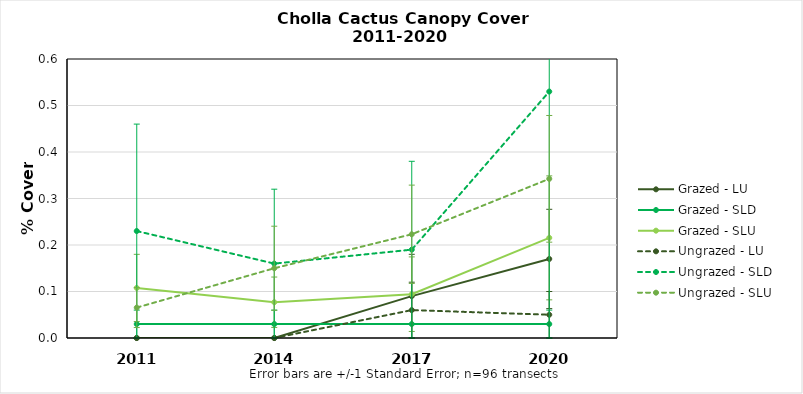
| Category | Grazed - LU | Grazed - SLD | Grazed - SLU | Ungrazed - LU | Ungrazed - SLD | Ungrazed - SLU |
|---|---|---|---|---|---|---|
| 2011.0 | 0 | 0.03 | 0.108 | 0 | 0.23 | 0.065 |
| 2014.0 | 0 | 0.03 | 0.077 | 0 | 0.16 | 0.15 |
| 2017.0 | 0.09 | 0.03 | 0.094 | 0.06 | 0.19 | 0.223 |
| 2020.0 | 0.17 | 0.03 | 0.215 | 0.05 | 0.53 | 0.342 |